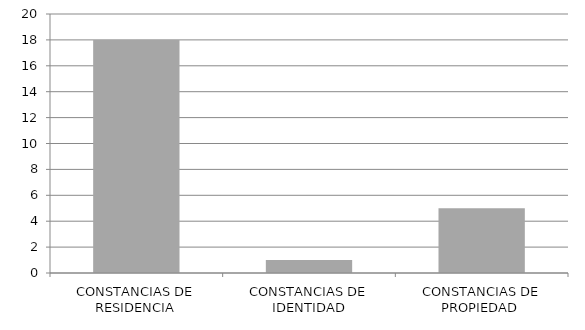
| Category | Series 0 |
|---|---|
| CONSTANCIAS DE RESIDENCIA | 18 |
| CONSTANCIAS DE IDENTIDAD | 1 |
| CONSTANCIAS DE PROPIEDAD  | 5 |